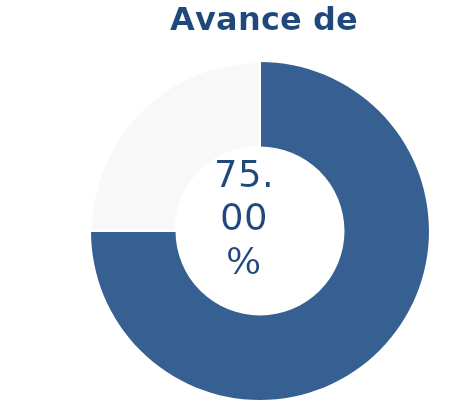
| Category | Series 0 |
|---|---|
| Acumulado 1 Trimestre | 0.75 |
| Año | -0.25 |